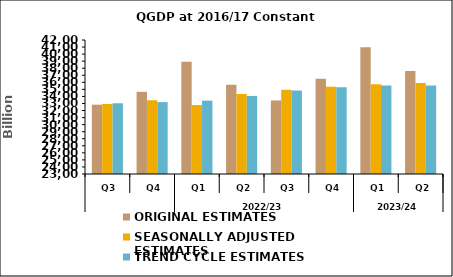
| Category | ORIGINAL ESTIMATES | SEASONALLY ADJUSTED ESTIMATES | TREND CYCLE ESTIMATES |
|---|---|---|---|
| 0 | 32829.395 | 32922.006 | 33028.219 |
| 1 | 34651.715 | 33454.463 | 33194.203 |
| 2 | 38924.085 | 32774.803 | 33400.85 |
| 3 | 35653.21 | 34350.227 | 34068.758 |
| 4 | 33424.558 | 34941.097 | 34837.702 |
| 5 | 36515.387 | 35374.299 | 35301.925 |
| 6 | 40989.076 | 35734.163 | 35536.753 |
| 7 | 37604.044 | 35912.528 | 35556.088 |